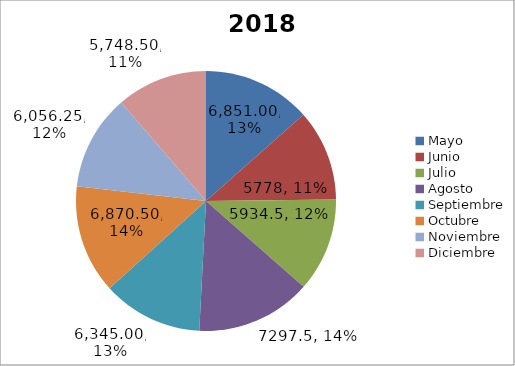
| Category | Año 2018 Valor $ 6,380 4,597.50 5,628.25 6,325.75 | Año 2018 Toneladas 255.2 183.9 225.13 .253.03 |
|---|---|---|
| Mayo | 6851 | 274.04 |
| Junio | 5778 | 231.12 |
| Julio | 5934.5 | 237.38 |
| Agosto | 7297.5 | 291.9 |
| Septiembre | 6345 | 253.8 |
| Octubre | 6870.5 | 274.82 |
| Noviembre | 6056.25 | 242.25 |
| Diciembre | 5748.5 | 229.94 |